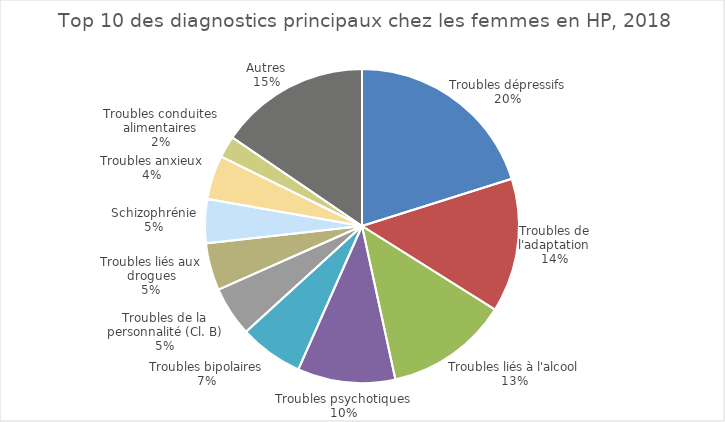
| Category | Fréquence |
|---|---|
| Troubles dépressifs | 4995 |
| Troubles de l'adaptation | 3419 |
| Troubles liés à l'alcool | 3141 |
| Troubles psychotiques | 2495 |
| Troubles bipolaires | 1634 |
| Troubles de la personnalité (Cl. B) | 1270 |
| Troubles liés aux drogues | 1208 |
| Schizophrénie | 1124 |
| Troubles anxieux | 1123 |
| Troubles conduites alimentaires | 557 |
| Autres | 3836 |